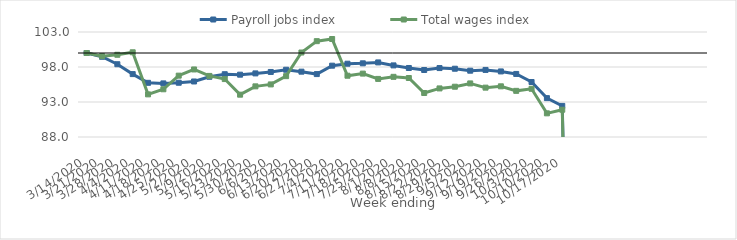
| Category | Payroll jobs index | Total wages index |
|---|---|---|
| 14/03/2020 | 100 | 100 |
| 21/03/2020 | 99.463 | 99.551 |
| 28/03/2020 | 98.395 | 99.747 |
| 04/04/2020 | 96.985 | 100.102 |
| 11/04/2020 | 95.741 | 94.091 |
| 18/04/2020 | 95.657 | 94.819 |
| 25/04/2020 | 95.751 | 96.764 |
| 02/05/2020 | 95.931 | 97.649 |
| 09/05/2020 | 96.606 | 96.727 |
| 16/05/2020 | 96.969 | 96.276 |
| 23/05/2020 | 96.903 | 94.047 |
| 30/05/2020 | 97.085 | 95.235 |
| 06/06/2020 | 97.292 | 95.512 |
| 13/06/2020 | 97.608 | 96.693 |
| 20/06/2020 | 97.333 | 100.068 |
| 27/06/2020 | 96.987 | 101.691 |
| 04/07/2020 | 98.188 | 101.998 |
| 11/07/2020 | 98.47 | 96.752 |
| 18/07/2020 | 98.527 | 97.057 |
| 25/07/2020 | 98.655 | 96.298 |
| 01/08/2020 | 98.228 | 96.594 |
| 08/08/2020 | 97.858 | 96.426 |
| 15/08/2020 | 97.572 | 94.288 |
| 22/08/2020 | 97.848 | 94.94 |
| 29/08/2020 | 97.753 | 95.181 |
| 05/09/2020 | 97.472 | 95.654 |
| 12/09/2020 | 97.582 | 95.051 |
| 19/09/2020 | 97.368 | 95.24 |
| 26/09/2020 | 97.008 | 94.593 |
| 03/10/2020 | 95.856 | 94.889 |
| 10/10/2020 | 93.552 | 91.38 |
| 17/10/2020 | 92.442 | 91.895 |